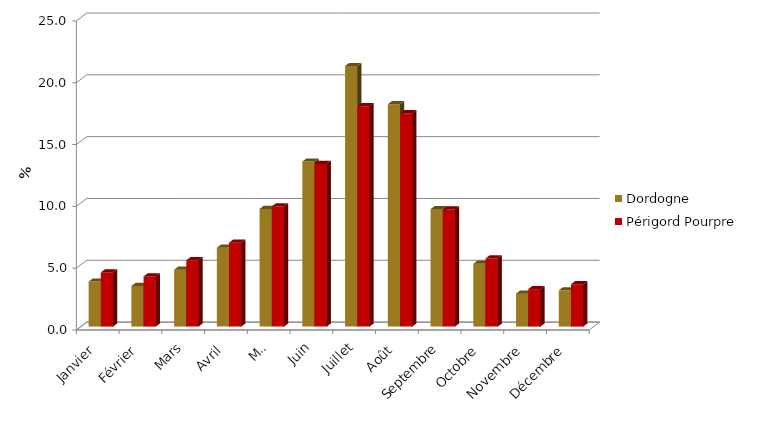
| Category | Dordogne | Périgord Pourpre |
|---|---|---|
| Janvier | 3.641 | 4.381 |
| Février | 3.283 | 4.059 |
| Mars | 4.599 | 5.364 |
| Avril | 6.378 | 6.789 |
| Mai | 9.519 | 9.72 |
| Juin | 13.349 | 13.157 |
| Juillet | 21.073 | 17.82 |
| Août | 17.982 | 17.257 |
| Septembre | 9.501 | 9.482 |
| Octobre | 5.082 | 5.511 |
| Novembre | 2.663 | 3.034 |
| Décembre | 2.931 | 3.425 |